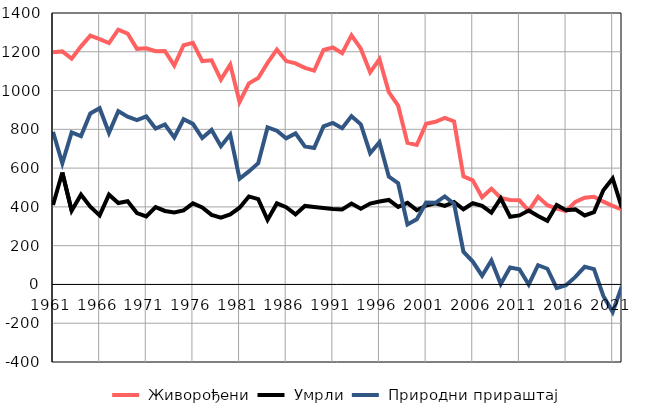
| Category |  Живорођени |  Умрли |  Природни прираштај |
|---|---|---|---|
| 1961.0 | 1197 | 410 | 787 |
| 1962.0 | 1202 | 577 | 625 |
| 1963.0 | 1164 | 380 | 784 |
| 1964.0 | 1228 | 463 | 765 |
| 1965.0 | 1283 | 401 | 882 |
| 1966.0 | 1265 | 356 | 909 |
| 1967.0 | 1245 | 463 | 782 |
| 1968.0 | 1314 | 420 | 894 |
| 1969.0 | 1294 | 429 | 865 |
| 1970.0 | 1215 | 368 | 847 |
| 1971.0 | 1218 | 351 | 867 |
| 1972.0 | 1203 | 399 | 804 |
| 1973.0 | 1204 | 379 | 825 |
| 1974.0 | 1129 | 371 | 758 |
| 1975.0 | 1234 | 382 | 852 |
| 1976.0 | 1246 | 418 | 828 |
| 1977.0 | 1152 | 397 | 755 |
| 1978.0 | 1156 | 359 | 797 |
| 1979.0 | 1057 | 344 | 713 |
| 1980.0 | 1134 | 361 | 773 |
| 1981.0 | 941 | 396 | 545 |
| 1982.0 | 1037 | 454 | 583 |
| 1983.0 | 1065 | 440 | 625 |
| 1984.0 | 1143 | 333 | 810 |
| 1985.0 | 1211 | 418 | 793 |
| 1986.0 | 1152 | 398 | 754 |
| 1987.0 | 1140 | 361 | 779 |
| 1988.0 | 1117 | 405 | 712 |
| 1989.0 | 1103 | 399 | 704 |
| 1990.0 | 1209 | 394 | 815 |
| 1991.0 | 1222 | 389 | 833 |
| 1992.0 | 1193 | 387 | 806 |
| 1993.0 | 1285 | 417 | 868 |
| 1994.0 | 1216 | 390 | 826 |
| 1995.0 | 1094 | 417 | 677 |
| 1996.0 | 1162 | 428 | 734 |
| 1997.0 | 992 | 436 | 556 |
| 1998.0 | 922 | 400 | 522 |
| 1999.0 | 730 | 421 | 309 |
| 2000.0 | 719 | 383 | 336 |
| 2001.0 | 829 | 407 | 422 |
| 2002.0 | 839 | 418 | 421 |
| 2003.0 | 859 | 405 | 454 |
| 2004.0 | 841 | 425 | 416 |
| 2005.0 | 557 | 388 | 169 |
| 2006.0 | 537 | 419 | 118 |
| 2007.0 | 450 | 405 | 45 |
| 2008.0 | 494 | 370 | 124 |
| 2009.0 | 446 | 444 | 2 |
| 2010.0 | 436 | 349 | 87 |
| 2011.0 | 434 | 356 | 78 |
| 2012.0 | 380 | 381 | -1 |
| 2013.0 | 452 | 353 | 99 |
| 2014.0 | 409 | 328 | 81 |
| 2015.0 | 391 | 410 | -19 |
| 2016.0 | 379 | 383 | -4 |
| 2017.0 | 426 | 387 | 39 |
| 2018.0 | 447 | 356 | 91 |
| 2019.0 | 452 | 373 | 79 |
| 2020.0 | 427 | 486 | -59 |
| 2021.0 | 405 | 547 | -142 |
| 2022.0 | 386 | 394 | -8 |